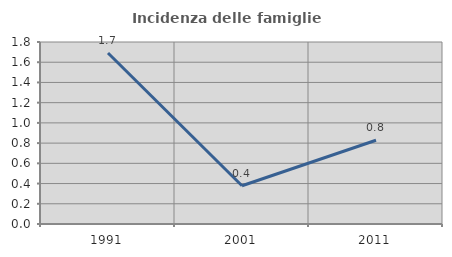
| Category | Incidenza delle famiglie numerose |
|---|---|
| 1991.0 | 1.692 |
| 2001.0 | 0.378 |
| 2011.0 | 0.829 |